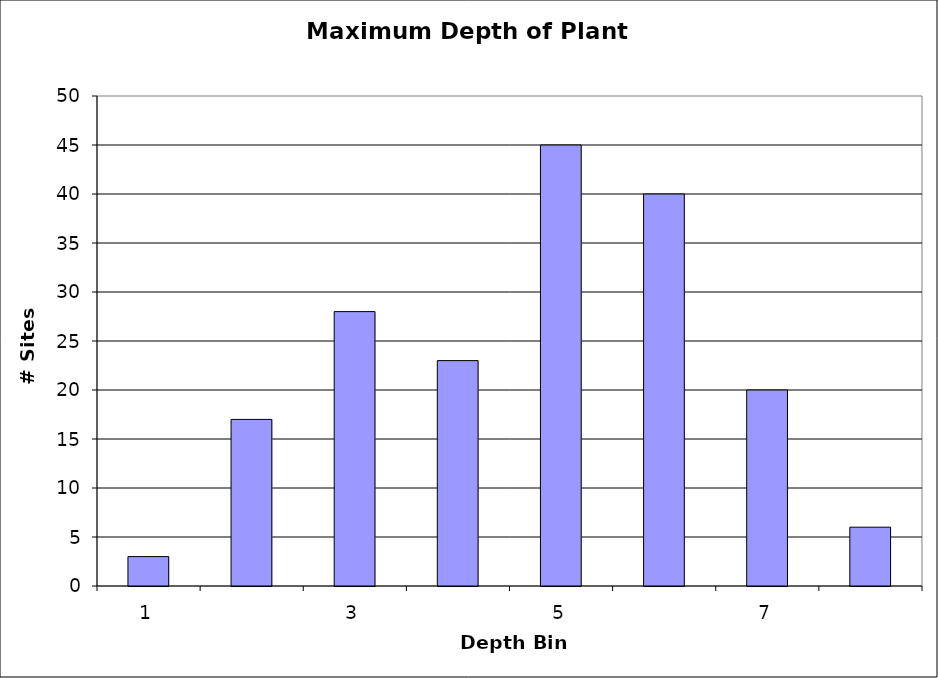
| Category | Series 0 |
|---|---|
| 1.0 | 3 |
| 2.0 | 17 |
| 3.0 | 28 |
| 4.0 | 23 |
| 5.0 | 45 |
| 6.0 | 40 |
| 7.0 | 20 |
| 8.0 | 6 |